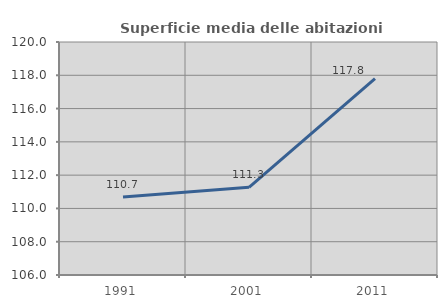
| Category | Superficie media delle abitazioni occupate |
|---|---|
| 1991.0 | 110.691 |
| 2001.0 | 111.266 |
| 2011.0 | 117.802 |